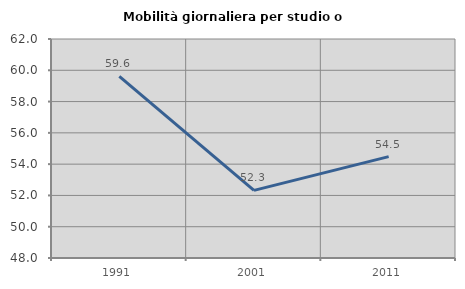
| Category | Mobilità giornaliera per studio o lavoro |
|---|---|
| 1991.0 | 59.612 |
| 2001.0 | 52.326 |
| 2011.0 | 54.479 |